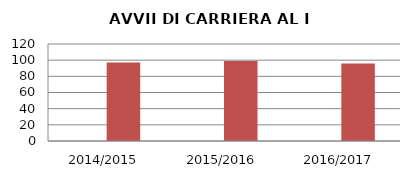
| Category | ANNO | NUMERO |
|---|---|---|
| 2014/2015 | 0 | 97 |
| 2015/2016 | 0 | 99 |
| 2016/2017 | 0 | 96 |